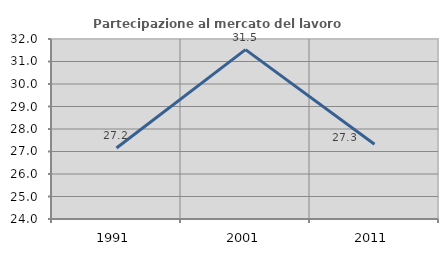
| Category | Partecipazione al mercato del lavoro  femminile |
|---|---|
| 1991.0 | 27.155 |
| 2001.0 | 31.527 |
| 2011.0 | 27.322 |